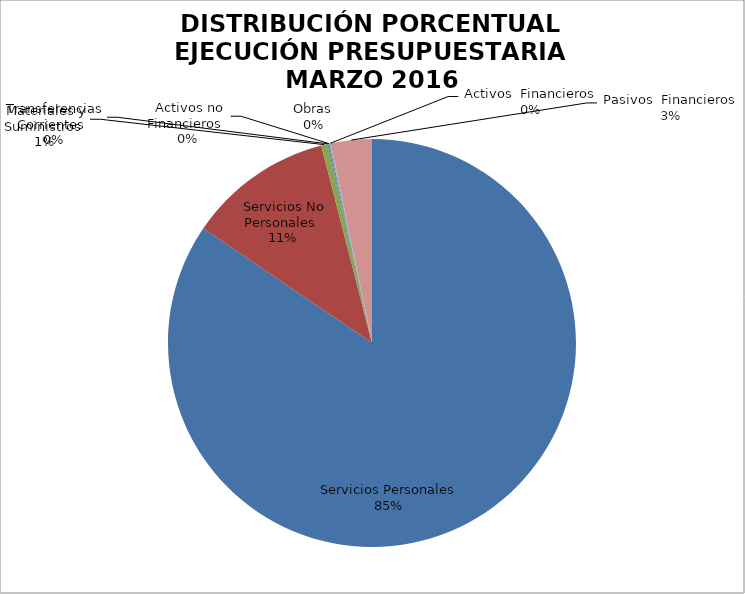
| Category | Series 0 | Series 1 |
|---|---|---|
| Servicios Personales | 21159687.28 | 0.845 |
| Servicios No Personales | 2876659.54 | 0.115 |
| Materiales y Suministros | 125254.44 | 0.005 |
| Transferencias Corrientes | 15000 | 0 |
| Activos no Financieros | 28684.99 | 0.001 |
| Obras | 0 | 0 |
| Activos  Financieros | 20800 | 0.001 |
| Pasivos  Financieros | 812269.33 | 0.032 |